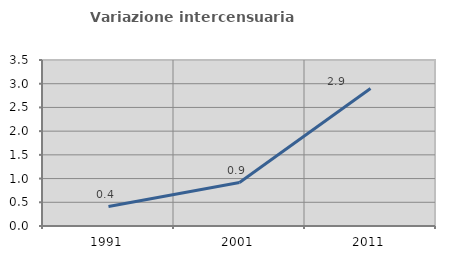
| Category | Variazione intercensuaria annua |
|---|---|
| 1991.0 | 0.409 |
| 2001.0 | 0.916 |
| 2011.0 | 2.9 |